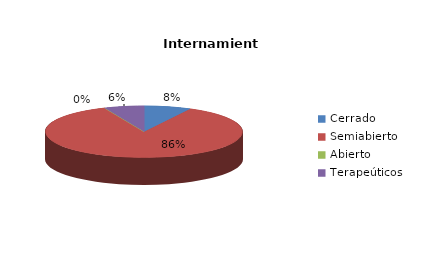
| Category | Series 0 |
|---|---|
| Cerrado | 19 |
| Semiabierto | 212 |
| Abierto | 0 |
| Terapeúticos | 16 |